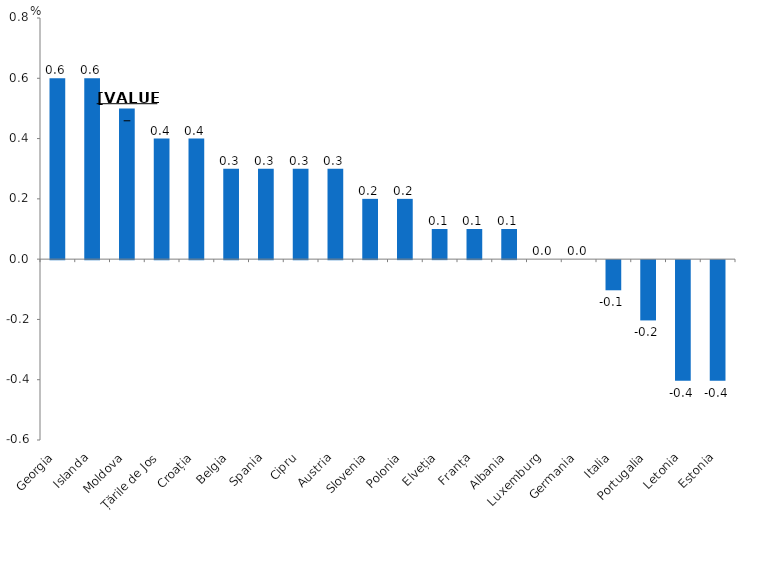
| Category | Series 0 |
|---|---|
| Georgia | 0.6 |
| Islanda | 0.6 |
| Moldova | 0.5 |
| Țările de Jos | 0.4 |
| Croația | 0.4 |
| Belgia | 0.3 |
| Spania | 0.3 |
| Cipru | 0.3 |
| Austria | 0.3 |
| Slovenia | 0.2 |
| Polonia | 0.2 |
| Elveția | 0.1 |
| Franța | 0.1 |
| Albania | 0.1 |
| Luxemburg | 0 |
| Germania | 0 |
| Italia | -0.1 |
| Portugalia | -0.2 |
| Letonia | -0.4 |
| Estonia | -0.4 |